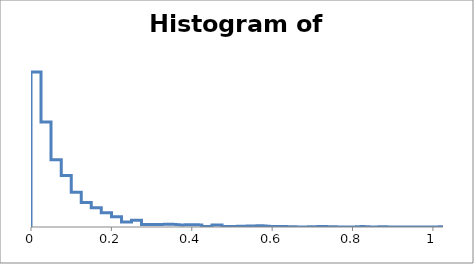
| Category | $E$3 |
|---|---|
| 0.0 | 0 |
| 0.0 | 599 |
| 0.025 | 599 |
| 0.025 | 406 |
| 0.05 | 406 |
| 0.05 | 260 |
| 0.075 | 260 |
| 0.075 | 199 |
| 0.1 | 199 |
| 0.1 | 134 |
| 0.125 | 134 |
| 0.125 | 95 |
| 0.15 | 95 |
| 0.15 | 74 |
| 0.175 | 74 |
| 0.175 | 55 |
| 0.2 | 55 |
| 0.2 | 40 |
| 0.225 | 40 |
| 0.225 | 19 |
| 0.25 | 19 |
| 0.25 | 26 |
| 0.275 | 26 |
| 0.275 | 10 |
| 0.3 | 10 |
| 0.3 | 10 |
| 0.325 | 10 |
| 0.325 | 11 |
| 0.35 | 11 |
| 0.35 | 8 |
| 0.375 | 8 |
| 0.375 | 9 |
| 0.4 | 9 |
| 0.4 | 8 |
| 0.425 | 8 |
| 0.425 | 2 |
| 0.45 | 2 |
| 0.45 | 8 |
| 0.475 | 8 |
| 0.475 | 2 |
| 0.5 | 2 |
| 0.5 | 3 |
| 0.525 | 3 |
| 0.525 | 4 |
| 0.55 | 4 |
| 0.55 | 5 |
| 0.575 | 5 |
| 0.575 | 2 |
| 0.6 | 2 |
| 0.6 | 2 |
| 0.625 | 2 |
| 0.625 | 1 |
| 0.65 | 1 |
| 0.65 | 0 |
| 0.675 | 0 |
| 0.675 | 1 |
| 0.7 | 1 |
| 0.7 | 2 |
| 0.725 | 2 |
| 0.725 | 1 |
| 0.75 | 1 |
| 0.75 | 0 |
| 0.775 | 0 |
| 0.775 | 0 |
| 0.8 | 0 |
| 0.8 | 2 |
| 0.825 | 2 |
| 0.825 | 0 |
| 0.85 | 0 |
| 0.85 | 1 |
| 0.875 | 1 |
| 0.875 | 0 |
| 0.9 | 0 |
| 0.9 | 0 |
| 0.925 | 0 |
| 0.925 | 0 |
| 0.95 | 0 |
| 0.95 | 0 |
| 0.975 | 0 |
| 0.975 | 0 |
| 1.0 | 0 |
| 1.0 | 1 |
| 1.025 | 1 |
| 1.025 | 0 |